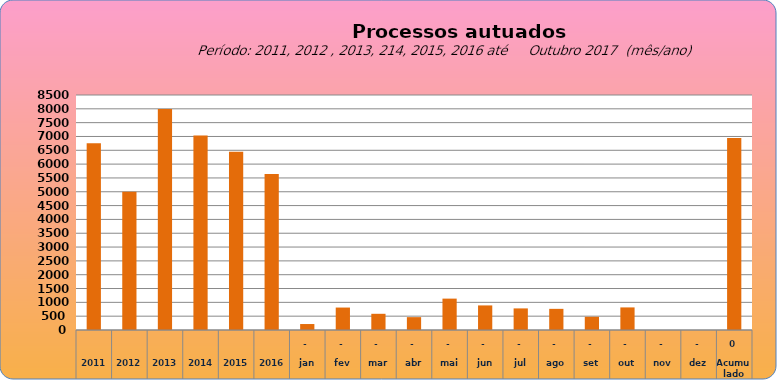
| Category | 6755 |
|---|---|
| 2011 | 6755 |
| 2012 | 4997 |
| 2013 | 7990 |
| 2014 | 7034 |
| 2015 | 6446 |
| 2016 | 5644 |
| jan | 216 |
| fev | 812 |
| mar | 586 |
| abr | 465 |
| mai | 1135 |
| jun | 889 |
| jul | 781 |
| ago | 765 |
| set | 478 |
| out | 817 |
| nov | 0 |
| dez | 0 |
| Acumulado
 | 6944 |